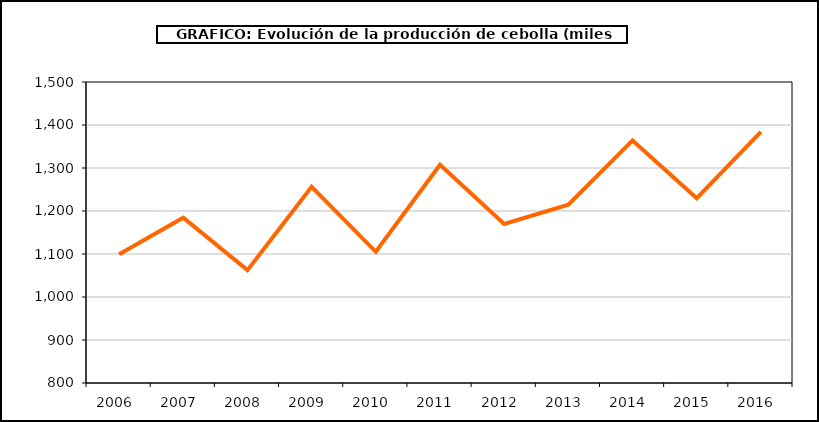
| Category | producción |
|---|---|
| 2006.0 | 1099.551 |
| 2007.0 | 1184.25 |
| 2008.0 | 1062.537 |
| 2009.0 | 1256.288 |
| 2010.0 | 1105.131 |
| 2011.0 | 1307.531 |
| 2012.0 | 1169.721 |
| 2013.0 | 1214.501 |
| 2014.0 | 1364.117 |
| 2015.0 | 1229.842 |
| 2016.0 | 1384.098 |